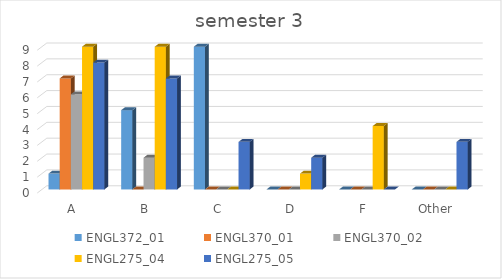
| Category | ENGL372_01 | ENGL370_01 | ENGL370_02 | ENGL275_04 | ENGL275_05 |
|---|---|---|---|---|---|
| A | 1 | 7 | 6 | 9 | 8 |
| B | 5 | 0 | 2 | 9 | 7 |
| C | 9 | 0 | 0 | 0 | 3 |
| D | 0 | 0 | 0 | 1 | 2 |
| F | 0 | 0 | 0 | 4 | 0 |
| Other | 0 | 0 | 0 | 0 | 3 |